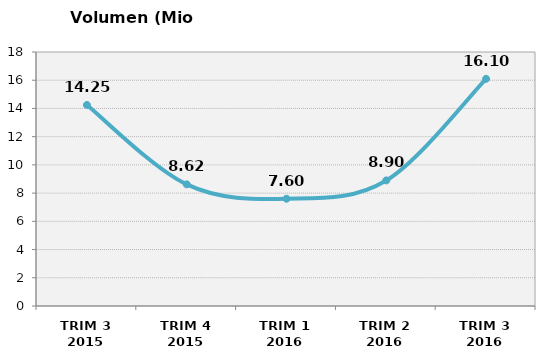
| Category | Volumen (Mio consumiciones) |
|---|---|
| TRIM 3 2015 | 14.246 |
| TRIM 4 2015 | 8.621 |
| TRIM 1 2016 | 7.6 |
| TRIM 2 2016 | 8.9 |
| TRIM 3 2016 | 16.1 |